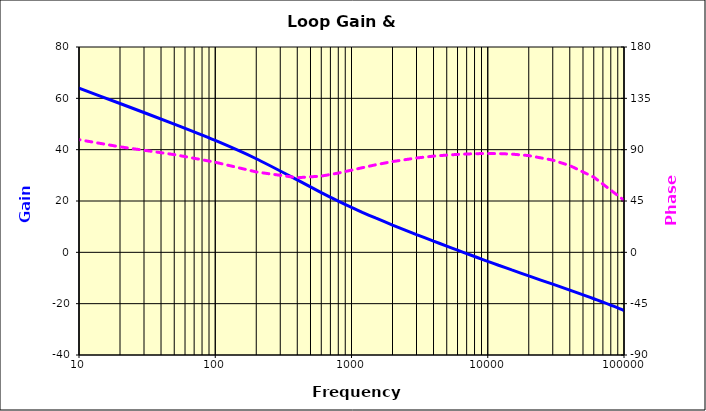
| Category | Gain |
|---|---|
| 1.0 | 77.908 |
| 2.0 | 75.537 |
| 5.0 | 69.576 |
| 10.0 | 63.931 |
| 20.0 | 57.994 |
| 50.0 | 49.956 |
| 100.0 | 43.583 |
| 200.0 | 36.46 |
| 400.0 | 28.234 |
| 600.0 | 23.287 |
| 800.0 | 19.951 |
| 1000.0 | 17.509 |
| 1200.0 | 15.607 |
| 1500.0 | 13.381 |
| 2000.0 | 10.638 |
| 3000.0 | 6.936 |
| 4000.0 | 4.381 |
| 5000.0 | 2.427 |
| 6000.0 | 0.846 |
| 7000.0 | -0.48 |
| 8000.0 | -1.621 |
| 9000.0 | -2.621 |
| 10000.0 | -3.509 |
| 12000.0 | -5.031 |
| 15000.0 | -6.867 |
| 20000.0 | -9.19 |
| 30000.0 | -12.412 |
| 40000.0 | -14.715 |
| 60000.0 | -18.079 |
| 100000.0 | -22.687 |
| 200000.0 | -30.835 |